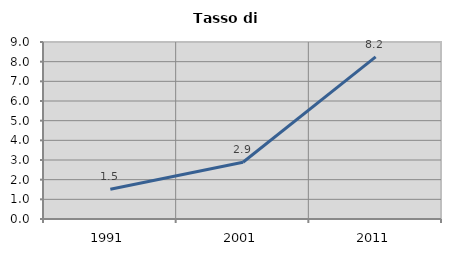
| Category | Tasso di disoccupazione   |
|---|---|
| 1991.0 | 1.515 |
| 2001.0 | 2.887 |
| 2011.0 | 8.247 |